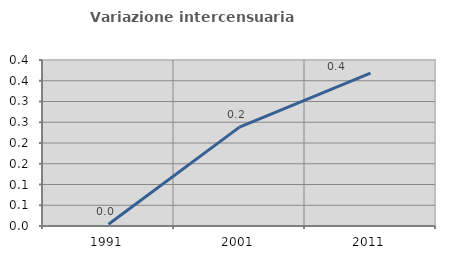
| Category | Variazione intercensuaria annua |
|---|---|
| 1991.0 | 0.004 |
| 2001.0 | 0.238 |
| 2011.0 | 0.369 |